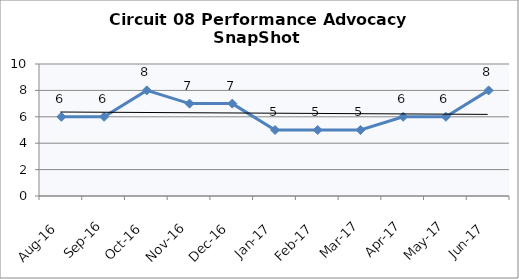
| Category | Circuit 08 |
|---|---|
| Aug-16 | 6 |
| Sep-16 | 6 |
| Oct-16 | 8 |
| Nov-16 | 7 |
| Dec-16 | 7 |
| Jan-17 | 5 |
| Feb-17 | 5 |
| Mar-17 | 5 |
| Apr-17 | 6 |
| May-17 | 6 |
| Jun-17 | 8 |